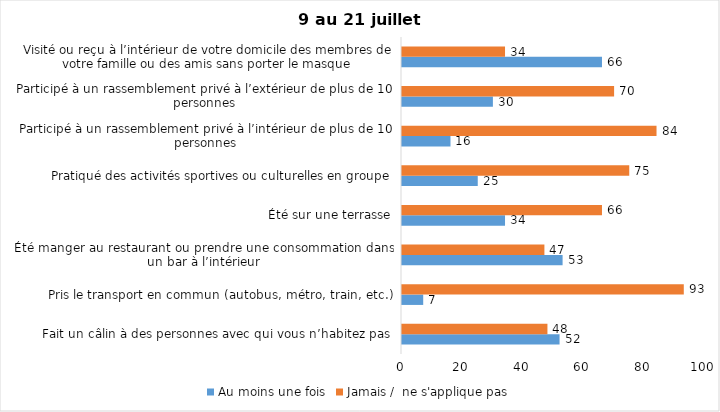
| Category | Au moins une fois | Jamais /  ne s'applique pas |
|---|---|---|
| Fait un câlin à des personnes avec qui vous n’habitez pas | 52 | 48 |
| Pris le transport en commun (autobus, métro, train, etc.) | 7 | 93 |
| Été manger au restaurant ou prendre une consommation dans un bar à l’intérieur | 53 | 47 |
| Été sur une terrasse | 34 | 66 |
| Pratiqué des activités sportives ou culturelles en groupe | 25 | 75 |
| Participé à un rassemblement privé à l’intérieur de plus de 10 personnes | 16 | 84 |
| Participé à un rassemblement privé à l’extérieur de plus de 10 personnes | 30 | 70 |
| Visité ou reçu à l’intérieur de votre domicile des membres de votre famille ou des amis sans porter le masque | 66 | 34 |